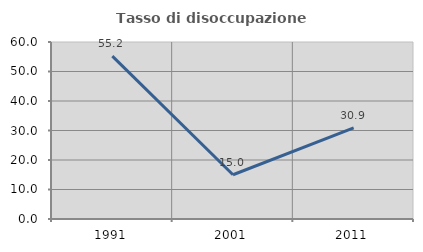
| Category | Tasso di disoccupazione giovanile  |
|---|---|
| 1991.0 | 55.224 |
| 2001.0 | 15 |
| 2011.0 | 30.882 |